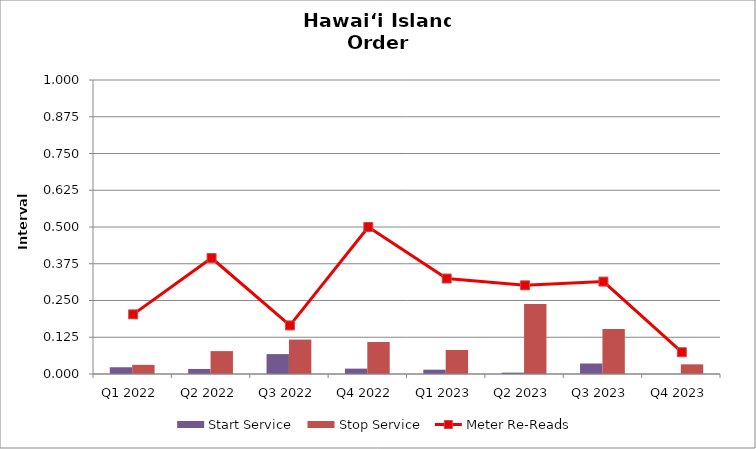
| Category | Start Service | Stop Service |
|---|---|---|
| Q1 2022 | 0.023 | 0.031 |
| Q2 2022 | 0.017 | 0.078 |
| Q3 2022 | 0.068 | 0.117 |
| Q4 2022 | 0.018 | 0.109 |
| Q1 2023 | 0.015 | 0.082 |
| Q2 2023 | 0.005 | 0.238 |
| Q3 2023 | 0.036 | 0.153 |
| Q4 2023 | 0 | 0.033 |